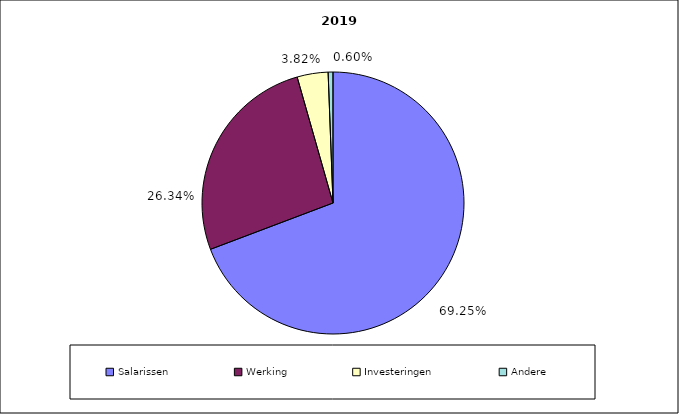
| Category | 2019 |
|---|---|
| Salarissen | 8413881 |
| Werking | 3200364 |
| Investeringen | 463899 |
| Andere | 72421 |